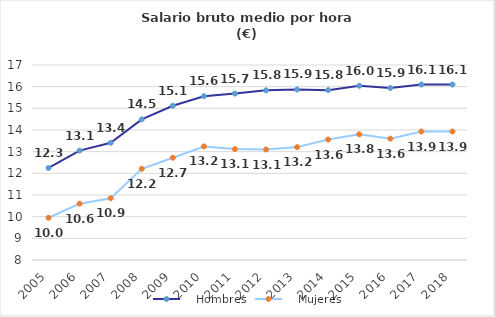
| Category |    Hombres |    Mujeres |
|---|---|---|
| 2005.0 | 12.25 | 9.95 |
| 2006.0 | 13.05 | 10.6 |
| 2007.0 | 13.41 | 10.85 |
| 2008.0 | 14.49 | 12.21 |
| 2009.0 | 15.12 | 12.72 |
| 2010.0 | 15.56 | 13.24 |
| 2011.0 | 15.68 | 13.12 |
| 2012.0 | 15.83 | 13.1 |
| 2013.0 | 15.87 | 13.21 |
| 2014.0 | 15.84 | 13.56 |
| 2015.0 | 16.04 | 13.8 |
| 2016.0 | 15.94 | 13.6 |
| 2017.0 | 16.1 | 13.93 |
| 2018.0 | 16.1 | 13.93 |